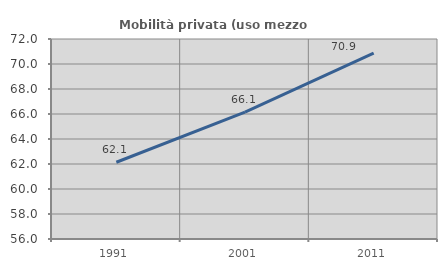
| Category | Mobilità privata (uso mezzo privato) |
|---|---|
| 1991.0 | 62.139 |
| 2001.0 | 66.15 |
| 2011.0 | 70.872 |